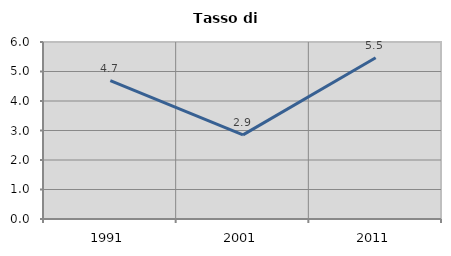
| Category | Tasso di disoccupazione   |
|---|---|
| 1991.0 | 4.688 |
| 2001.0 | 2.852 |
| 2011.0 | 5.465 |